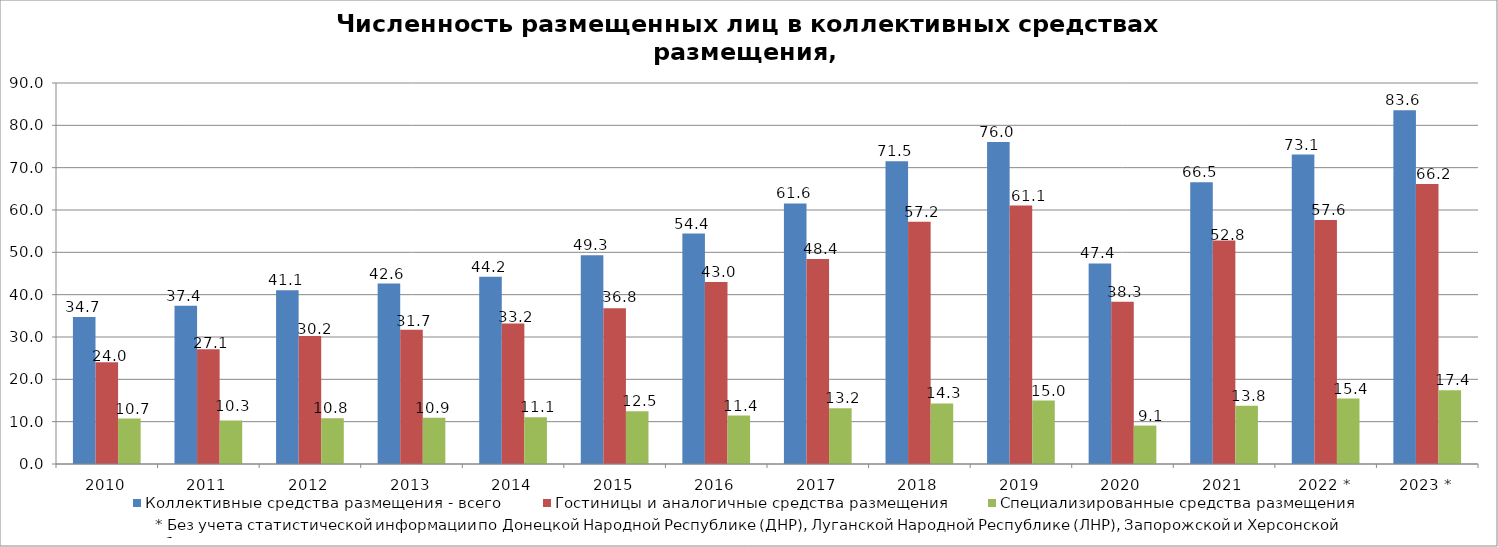
| Category | Коллективные средства размещения - всего | Гостиницы и аналогичные средства размещения | Специализированные средства размещения |
|---|---|---|---|
| 2010 | 34.746 | 24.026 | 10.721 |
| 2011 | 37.399 | 27.112 | 10.287 |
| 2012 | 41.065 | 30.235 | 10.83 |
| 2013 | 42.635 | 31.733 | 10.902 |
| 2014 | 44.219 | 33.16 | 11.059 |
| 2015 | 49.284 | 36.817 | 12.467 |
| 2016 | 54.431 | 42.981 | 11.45 |
| 2017 | 61.563 | 48.412 | 13.151 |
| 2018 | 71.538 | 57.243 | 14.295 |
| 2019 | 76.042 | 61.059 | 14.983 |
| 2020 | 47.382 | 38.31 | 9.073 |
| 2021 | 66.54 | 52.772 | 13.768 |
| 2022 * | 73.093 | 57.647 | 15.446 |
| 2023 * | 83.578 | 66.168 | 17.411 |